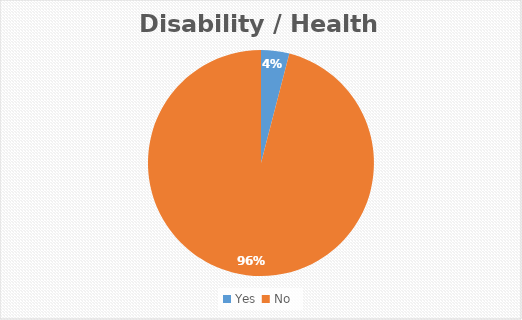
| Category | Series 0 |
|---|---|
| Yes  | 0.04 |
| No  | 0.96 |